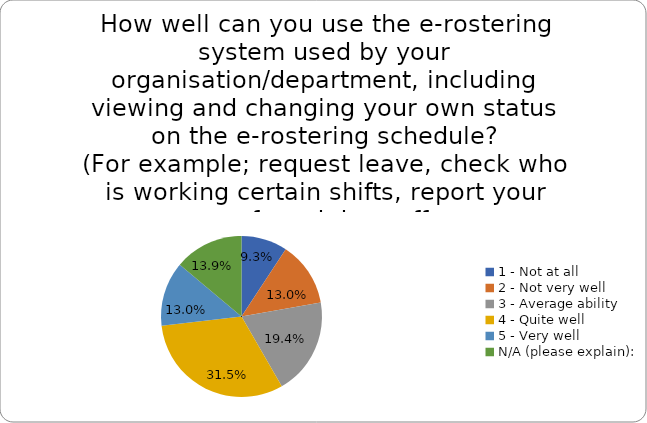
| Category | Series 0 |
|---|---|
| 1 - Not at all | 0.093 |
| 2 - Not very well | 0.13 |
| 3 - Average ability | 0.194 |
| 4 - Quite well | 0.315 |
| 5 - Very well | 0.13 |
| N/A (please explain): | 0.139 |